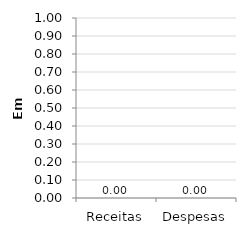
| Category | Series 0 |
|---|---|
| Receitas | 0 |
| Despesas | 0 |